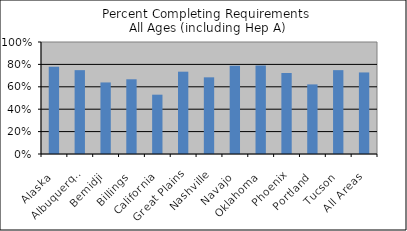
| Category | % Comp. Req w/ Hep A |
|---|---|
| Alaska | 0.779 |
| Albuquerque | 0.749 |
| Bemidji | 0.639 |
| Billings | 0.667 |
| California | 0.53 |
| Great Plains | 0.735 |
| Nashville | 0.685 |
| Navajo | 0.789 |
| Oklahoma | 0.79 |
| Phoenix | 0.723 |
| Portland | 0.621 |
| Tucson | 0.749 |
| All Areas | 0.728 |